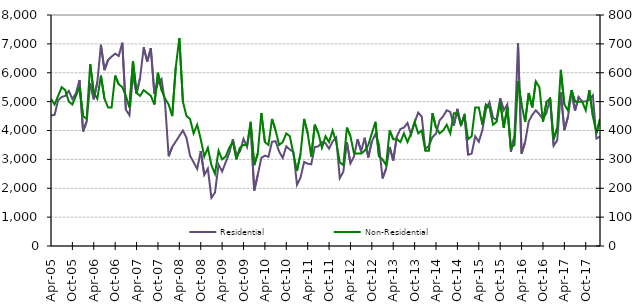
| Category | Residential |
|---|---|
| 2005-04-01 | 4520 |
| 2005-05-01 | 4540 |
| 2005-06-01 | 5050 |
| 2005-07-01 | 5160 |
| 2005-08-01 | 5200 |
| 2005-09-01 | 5370 |
| 2005-10-01 | 5090 |
| 2005-11-01 | 5290 |
| 2005-12-01 | 5750 |
| 2006-01-01 | 3970 |
| 2006-02-01 | 4310 |
| 2006-03-01 | 5630 |
| 2006-04-01 | 5080 |
| 2006-05-01 | 5680 |
| 2006-06-01 | 6970 |
| 2006-07-01 | 6090 |
| 2006-08-01 | 6440 |
| 2006-09-01 | 6560 |
| 2006-10-01 | 6660 |
| 2006-11-01 | 6580 |
| 2006-12-01 | 7040 |
| 2007-01-01 | 4720 |
| 2007-02-01 | 4530 |
| 2007-03-01 | 5940 |
| 2007-04-01 | 5280 |
| 2007-05-01 | 5830 |
| 2007-06-01 | 6880 |
| 2007-07-01 | 6390 |
| 2007-08-01 | 6850 |
| 2007-09-01 | 5270 |
| 2007-10-01 | 5660 |
| 2007-11-01 | 5790 |
| 2007-12-01 | 4940 |
| 2008-01-01 | 3110 |
| 2008-02-01 | 3430 |
| 2008-03-01 | 3620 |
| 2008-04-01 | 3810 |
| 2008-05-01 | 4000 |
| 2008-06-01 | 3750 |
| 2008-07-01 | 3130 |
| 2008-08-01 | 2900 |
| 2008-09-01 | 2670 |
| 2008-10-01 | 3290 |
| 2008-11-01 | 2460 |
| 2008-12-01 | 2680 |
| 2009-01-01 | 1670 |
| 2009-02-01 | 1850 |
| 2009-03-01 | 2820 |
| 2009-04-01 | 2580 |
| 2009-05-01 | 2900 |
| 2009-06-01 | 3220 |
| 2009-07-01 | 3700 |
| 2009-08-01 | 3130 |
| 2009-09-01 | 3270 |
| 2009-10-01 | 3710 |
| 2009-11-01 | 3430 |
| 2009-12-01 | 4210 |
| 2010-01-01 | 1920 |
| 2010-02-01 | 2460 |
| 2010-03-01 | 3050 |
| 2010-04-01 | 3130 |
| 2010-05-01 | 3090 |
| 2010-06-01 | 3610 |
| 2010-07-01 | 3630 |
| 2010-08-01 | 3270 |
| 2010-09-01 | 3050 |
| 2010-10-01 | 3450 |
| 2010-11-01 | 3340 |
| 2010-12-01 | 3260 |
| 2011-01-01 | 2120 |
| 2011-02-01 | 2370 |
| 2011-03-01 | 2910 |
| 2011-04-01 | 2850 |
| 2011-05-01 | 2830 |
| 2011-06-01 | 3430 |
| 2011-07-01 | 3450 |
| 2011-08-01 | 3600 |
| 2011-09-01 | 3560 |
| 2011-10-01 | 3370 |
| 2011-11-01 | 3620 |
| 2011-12-01 | 3760 |
| 2012-01-01 | 2350 |
| 2012-02-01 | 2570 |
| 2012-03-01 | 3600 |
| 2012-04-01 | 2860 |
| 2012-05-01 | 3100 |
| 2012-06-01 | 3700 |
| 2012-07-01 | 3280 |
| 2012-08-01 | 3750 |
| 2012-09-01 | 3070 |
| 2012-10-01 | 3620 |
| 2012-11-01 | 3870 |
| 2012-12-01 | 3510 |
| 2013-01-01 | 2340 |
| 2013-02-01 | 2680 |
| 2013-03-01 | 3430 |
| 2013-04-01 | 2960 |
| 2013-05-01 | 3790 |
| 2013-06-01 | 4050 |
| 2013-07-01 | 4100 |
| 2013-08-01 | 4260 |
| 2013-09-01 | 3860 |
| 2013-10-01 | 4280 |
| 2013-11-01 | 4620 |
| 2013-12-01 | 4480 |
| 2014-01-01 | 3350 |
| 2014-02-01 | 3470 |
| 2014-03-01 | 3770 |
| 2014-04-01 | 3890 |
| 2014-05-01 | 4350 |
| 2014-06-01 | 4490 |
| 2014-07-01 | 4700 |
| 2014-08-01 | 4640 |
| 2014-09-01 | 4170 |
| 2014-10-01 | 4750 |
| 2014-11-01 | 4170 |
| 2014-12-01 | 4560 |
| 2015-01-01 | 3160 |
| 2015-02-01 | 3200 |
| 2015-03-01 | 3800 |
| 2015-04-01 | 3610 |
| 2015-05-01 | 4010 |
| 2015-06-01 | 4720 |
| 2015-07-01 | 4980 |
| 2015-08-01 | 4440 |
| 2015-09-01 | 4370 |
| 2015-10-01 | 5120 |
| 2015-11-01 | 4700 |
| 2015-12-01 | 4900 |
| 2016-01-01 | 3260 |
| 2016-02-01 | 3810 |
| 2016-03-01 | 7020 |
| 2016-04-01 | 3200 |
| 2016-05-01 | 3600 |
| 2016-06-01 | 4310 |
| 2016-07-01 | 4540 |
| 2016-08-01 | 4700 |
| 2016-09-01 | 4560 |
| 2016-10-01 | 4400 |
| 2016-11-01 | 4610 |
| 2016-12-01 | 5140 |
| 2017-01-01 | 3470 |
| 2017-02-01 | 3660 |
| 2017-03-01 | 5320 |
| 2017-04-01 | 4010 |
| 2017-05-01 | 4470 |
| 2017-06-01 | 5320 |
| 2017-07-01 | 4690 |
| 2017-08-01 | 5160 |
| 2017-09-01 | 5000 |
| 2017-10-01 | 5010 |
| 2017-11-01 | 5070 |
| 2017-12-01 | 5220 |
| 2018-01-01 | 3720 |
| 2018-02-01 | 3790 |